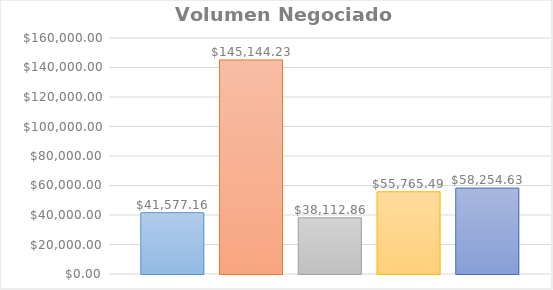
| Category | Lunes | Martes | Miercoles | Jueves | Viernes |
|---|---|---|---|---|---|
| 0 | 41577.16 | 145144.23 | 38112.86 | 55765.49 | 58254.63 |